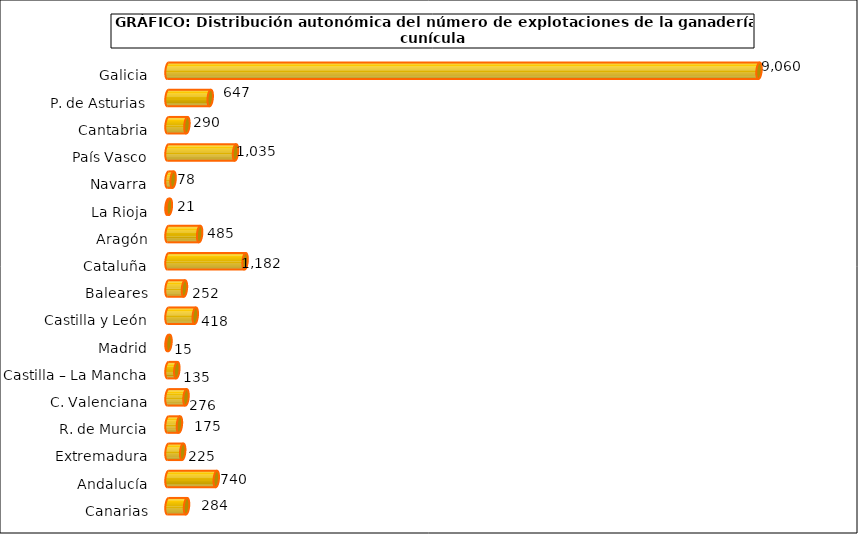
| Category | num. Explotaciones |
|---|---|
| 0 | 9060 |
| 1 | 647 |
| 2 | 290 |
| 3 | 1035 |
| 4 | 78 |
| 5 | 21 |
| 6 | 485 |
| 7 | 1182 |
| 8 | 252 |
| 9 | 418 |
| 10 | 15 |
| 11 | 135 |
| 12 | 276 |
| 13 | 175 |
| 14 | 225 |
| 15 | 740 |
| 16 | 284 |